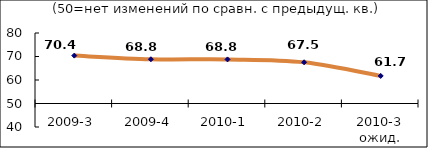
| Category | Диф.индекс ↓ |
|---|---|
| 2009-3 | 70.385 |
| 2009-4 | 68.825 |
| 2010-1 | 68.76 |
| 2010-2 | 67.535 |
| 2010-3 ожид. | 61.735 |